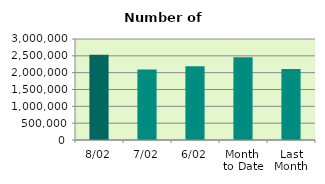
| Category | Series 0 |
|---|---|
| 8/02 | 2531520 |
| 7/02 | 2094574 |
| 6/02 | 2191122 |
| Month 
to Date | 2455297.333 |
| Last
Month | 2107310.455 |